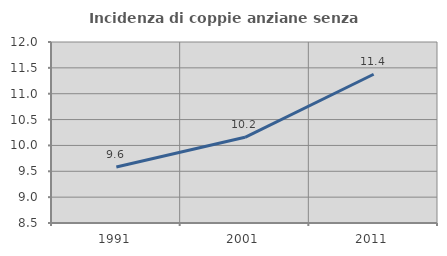
| Category | Incidenza di coppie anziane senza figli  |
|---|---|
| 1991.0 | 9.582 |
| 2001.0 | 10.157 |
| 2011.0 | 11.376 |